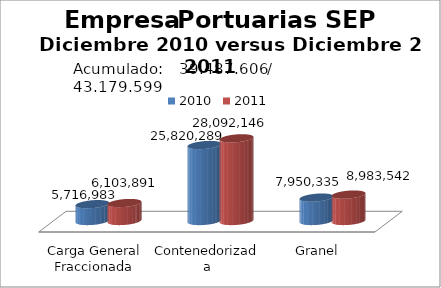
| Category | 2010 | 2011 |
|---|---|---|
| Carga General Fraccionada | 5716983.135 | 6103891.238 |
| Contenedorizada | 25820288.71 | 28092145.917 |
| Granel | 7950334.589 | 8983542.156 |